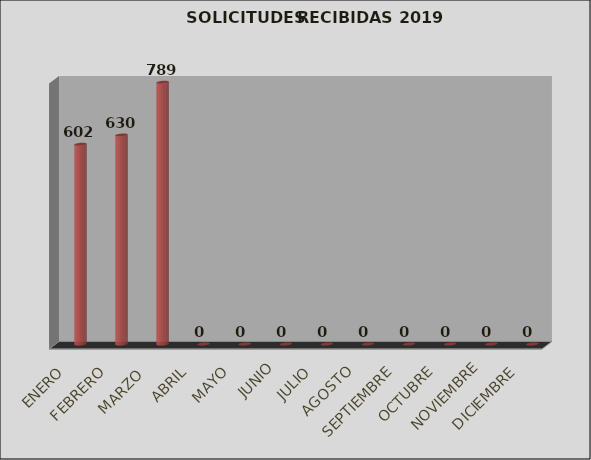
| Category | Series 0 | Series 1 |
|---|---|---|
| ENERO |  | 602 |
| FEBRERO |  | 630 |
| MARZO  |  | 789 |
| ABRIL |  | 0 |
| MAYO |  | 0 |
| JUNIO |  | 0 |
| JULIO |  | 0 |
| AGOSTO |  | 0 |
| SEPTIEMBRE |  | 0 |
| OCTUBRE |  | 0 |
| NOVIEMBRE |  | 0 |
| DICIEMBRE |  | 0 |